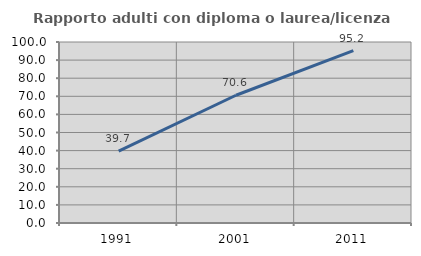
| Category | Rapporto adulti con diploma o laurea/licenza media  |
|---|---|
| 1991.0 | 39.665 |
| 2001.0 | 70.584 |
| 2011.0 | 95.23 |